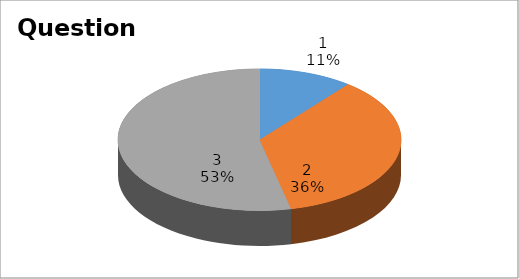
| Category | Series 0 |
|---|---|
| 0 | 3 |
| 1 | 10 |
| 2 | 15 |